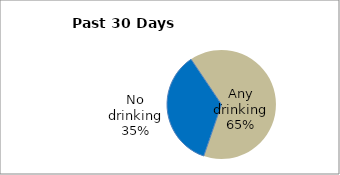
| Category | Series 0 |
|---|---|
| No drinking | 35.305 |
| Any drinking | 64.695 |